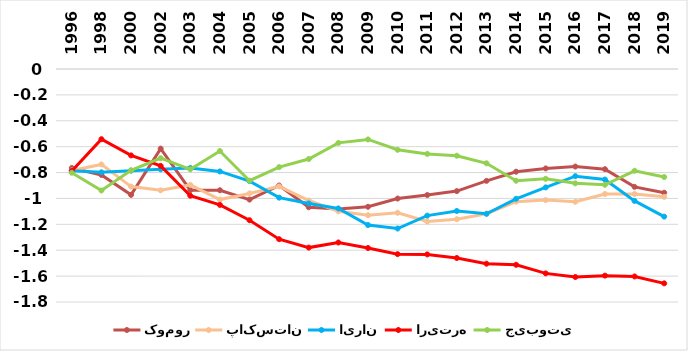
| Category | کومور | پاکستان | ایران | اریتره | جیبوتی |
|---|---|---|---|---|---|
| 1996.0 | -0.765 | -0.783 | -0.786 | -0.788 | -0.802 |
| 1998.0 | -0.818 | -0.737 | -0.798 | -0.542 | -0.939 |
| 2000.0 | -0.972 | -0.908 | -0.786 | -0.668 | -0.782 |
| 2002.0 | -0.615 | -0.937 | -0.775 | -0.748 | -0.689 |
| 2003.0 | -0.936 | -0.896 | -0.765 | -0.979 | -0.775 |
| 2004.0 | -0.937 | -1.009 | -0.791 | -1.05 | -0.634 |
| 2005.0 | -1.009 | -0.961 | -0.866 | -1.168 | -0.863 |
| 2006.0 | -0.9 | -0.907 | -0.994 | -1.315 | -0.758 |
| 2007.0 | -1.068 | -1.016 | -1.039 | -1.38 | -0.695 |
| 2008.0 | -1.081 | -1.099 | -1.077 | -1.34 | -0.571 |
| 2009.0 | -1.064 | -1.13 | -1.206 | -1.383 | -0.544 |
| 2010.0 | -1.001 | -1.111 | -1.232 | -1.43 | -0.624 |
| 2011.0 | -0.974 | -1.178 | -1.133 | -1.432 | -0.656 |
| 2012.0 | -0.943 | -1.16 | -1.097 | -1.46 | -0.67 |
| 2013.0 | -0.864 | -1.118 | -1.119 | -1.504 | -0.729 |
| 2014.0 | -0.793 | -1.025 | -1.003 | -1.513 | -0.863 |
| 2015.0 | -0.768 | -1.013 | -0.915 | -1.579 | -0.848 |
| 2016.0 | -0.754 | -1.026 | -0.828 | -1.607 | -0.883 |
| 2017.0 | -0.774 | -0.965 | -0.854 | -1.596 | -0.895 |
| 2018.0 | -0.911 | -0.965 | -1.019 | -1.603 | -0.786 |
| 2019.0 | -0.956 | -0.988 | -1.14 | -1.656 | -0.834 |